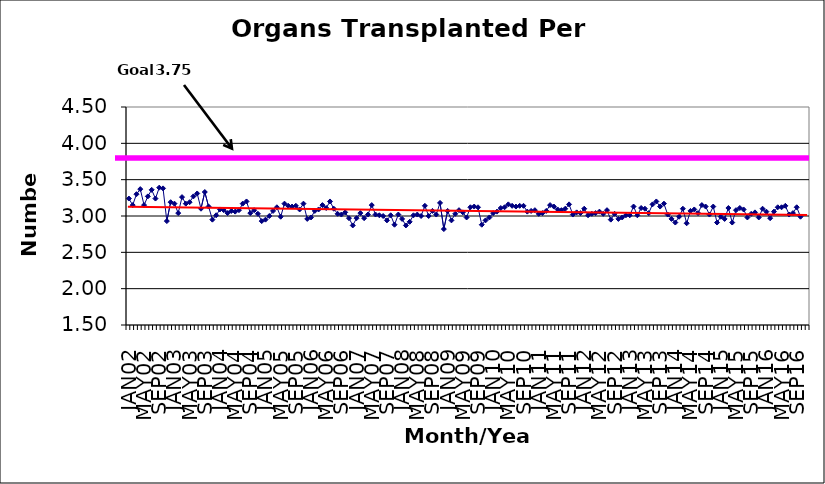
| Category | Series 0 |
|---|---|
| JAN02 | 3.24 |
| FEB02 | 3.15 |
| MAR02 | 3.3 |
| APR02 | 3.37 |
| MAY02 | 3.15 |
| JUN02 | 3.27 |
| JUL02 | 3.36 |
| AUG02 | 3.24 |
| SEP02 | 3.39 |
| OCT02 | 3.38 |
| NOV02 | 2.93 |
| DEC02 | 3.19 |
| JAN03 | 3.17 |
| FEB03 | 3.04 |
| MAR03 | 3.26 |
| APR03 | 3.17 |
| MAY03 | 3.19 |
| JUN03 | 3.27 |
| JUL03 | 3.31 |
| AUG03 | 3.1 |
| SEP03 | 3.33 |
| OCT03 | 3.13 |
| NOV03 | 2.95 |
| DEC03 | 3.01 |
| JAN04 | 3.09 |
| FEB04 | 3.08 |
| MAR04 | 3.04 |
| APR04 | 3.07 |
| MAY04 | 3.06 |
| JUN04 | 3.08 |
| JUL04 | 3.17 |
| AUG04 | 3.2 |
| SEP04 | 3.04 |
| OCT04 | 3.08 |
| NOV04 | 3.03 |
| DEC04 | 2.93 |
| JAN05 | 2.95 |
| FEB05 | 3 |
| MAR05 | 3.07 |
| APR05 | 3.12 |
| MAY05 | 2.99 |
| JUN05 | 3.17 |
| JUL05 | 3.14 |
| AUG05 | 3.13 |
| SEP05 | 3.14 |
| OCT05 | 3.09 |
| NOV05 | 3.17 |
| DEC05 | 2.96 |
| JAN06 | 2.98 |
| FEB06 | 3.07 |
| MAR06 | 3.09 |
| APR06 | 3.15 |
| MAY06 | 3.11 |
| JUN06 | 3.2 |
| JUL06 | 3.1 |
| AUG06 | 3.03 |
| SEP06 | 3.02 |
| OCT06 | 3.05 |
| NOV06 | 2.97 |
| DEC06 | 2.87 |
| JAN07 | 2.97 |
| FEB07 | 3.04 |
| MAR07 | 2.97 |
| APR07 | 3.02 |
| MAY07 | 3.15 |
| JUN07 | 3.02 |
| JUL07 | 3.01 |
| AUG07 | 3 |
| SEP07 | 2.94 |
| OCT07 | 3.01 |
| NOV07 | 2.88 |
| DEC07 | 3.02 |
| JAN08 | 2.96 |
| FEB08 | 2.87 |
| MAR08 | 2.92 |
| APR08 | 3.01 |
| MAY08 | 3.02 |
| JUN08 | 3 |
| JUL08 | 3.14 |
| AUG08 | 3 |
| SEP08 | 3.07 |
| OCT08 | 3.02 |
| NOV08 | 3.18 |
| DEC08 | 2.82 |
| JAN09 | 3.07 |
| FEB09 | 2.94 |
| MAR09 | 3.03 |
| APR09 | 3.08 |
| MAY09 | 3.05 |
| JUN09 | 2.98 |
| JUL09 | 3.12 |
| AUG09 | 3.13 |
| SEP09 | 3.12 |
| OCT09 | 2.88 |
| NOV09 | 2.94 |
| DEC09 | 2.98 |
| JAN10 | 3.04 |
| FEB10 | 3.06 |
| MAR10 | 3.11 |
| APR10 | 3.12 |
| MAY10 | 3.16 |
| JUN10 | 3.14 |
| JUL10 | 3.13 |
| AUG10 | 3.14 |
| SEP10 | 3.14 |
| OCT10 | 3.06 |
| NOV10 | 3.07 |
| DEC10 | 3.08 |
| JAN11 | 3.03 |
| FEB11 | 3.04 |
| MAR11 | 3.07 |
| APR11 | 3.15 |
| MAY11 | 3.13 |
| JUN11 | 3.09 |
| JUL11 | 3.08 |
| AUG11 | 3.1 |
| SEP11 | 3.16 |
| OCT11 | 3.02 |
| NOV11 | 3.05 |
| DEC11 | 3.04 |
| JAN12 | 3.1 |
| FEB12 | 3.01 |
| MAR12 | 3.03 |
| APR12 | 3.04 |
| MAY12 | 3.06 |
| JUN12 | 3.03 |
| JUL12 | 3.08 |
| AUG12 | 2.95 |
| SEP12 | 3.03 |
| OCT12 | 2.96 |
| NOV12 | 2.98 |
| DEC12 | 3.01 |
| JAN13 | 3.01 |
| FEB13 | 3.13 |
| MAR13 | 3.01 |
| APR13 | 3.11 |
| MAY13 | 3.1 |
| JUN13 | 3.04 |
| JUL13 | 3.16 |
| AUG13 | 3.2 |
| SEP13 | 3.13 |
| OCT13 | 3.17 |
| NOV13 | 3.02 |
| DEC13 | 2.96 |
| JAN14 | 2.91 |
| FEB14 | 2.99 |
| MAR14 | 3.1 |
| APR14 | 2.9 |
| MAY14 | 3.07 |
| JUN14 | 3.09 |
| JUL14 | 3.04 |
| AUG14 | 3.15 |
| SEP14 | 3.13 |
| OCT14 | 3.02 |
| NOV14 | 3.13 |
| DEC14 | 2.91 |
| JAN15 | 2.99 |
| FEB15 | 2.96 |
| MAR15 | 3.11 |
| APR15 | 2.91 |
| MAY15 | 3.08 |
| JUN15 | 3.11 |
| JUL15 | 3.09 |
| AUG15 | 2.98 |
| SEP15 | 3.03 |
| OCT15 | 3.05 |
| NOV15 | 2.98 |
| DEC15 | 3.1 |
| JAN16 | 3.06 |
| FEB16 | 2.97 |
| MAR16 | 3.06 |
| APR16 | 3.12 |
| MAY16 | 3.12 |
| JUN16 | 3.14 |
| JUL16 | 3.02 |
| AUG16 | 3.04 |
| SEP16 | 3.12 |
| OCT16 | 2.99 |